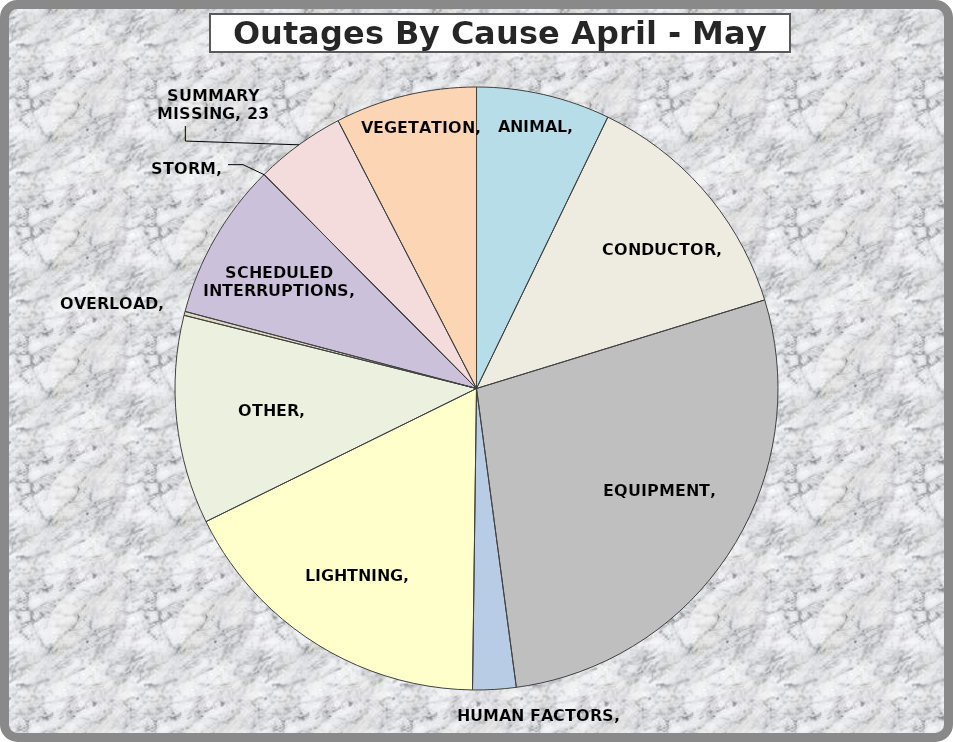
| Category | Series 0 |
|---|---|
| ANIMAL | 34 |
| CONDUCTOR | 62 |
| EQUIPMENT | 131 |
| HUMAN FACTORS | 11 |
| LIGHTNING | 83 |
| OTHER | 53 |
| OVERLOAD | 1 |
| SCHEDULED INTERRUPTIONS | 40 |
| STORM | 0 |
| SUMMARY MISSING | 23 |
| VEGETATION | 36 |